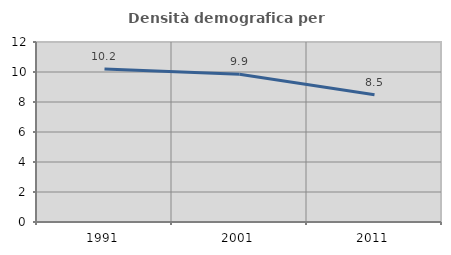
| Category | Densità demografica |
|---|---|
| 1991.0 | 10.202 |
| 2001.0 | 9.854 |
| 2011.0 | 8.485 |